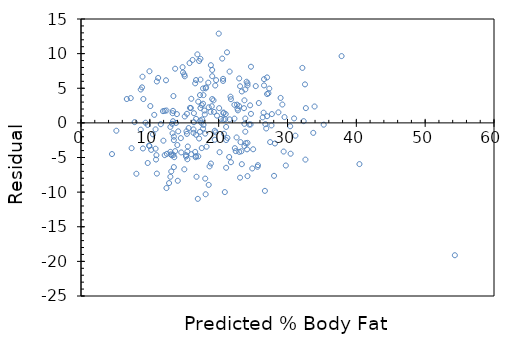
| Category | Series 0 |
|---|---|
| 14.50261858650596 | -2.203 |
| 13.110198963243775 | -7.01 |
| 16.211497215055005 | 9.089 |
| 15.262120199194428 | -4.862 |
| 23.86980514299701 | 4.83 |
| 20.325464283784186 | 0.575 |
| 17.983667644661416 | 1.216 |
| 16.59124802139923 | -4.191 |
| 12.793739957956916 | -8.694 |
| 16.6545398224566 | -4.955 |
| 13.489949769588002 | -6.39 |
| 18.110251246776166 | -10.31 |
| 18.55329385417776 | 2.247 |
| 25.009057562029696 | -3.809 |
| 21.59130030493162 | 0.509 |
| 19.312795466866227 | 1.587 |
| 21.59130030493162 | 7.409 |
| 22.287510116562707 | 0.612 |
| 17.287457833030324 | -1.287 |
| 24.18626414828387 | -7.686 |
| 21.274841299644763 | -2.175 |
| 23.110303530308542 | -7.91 |
| 8.932940093457233 | 6.667 |
| 11.211444931522621 | 6.489 |
| 8.869648292399852 | 5.13 |
| 11.021569528350504 | -7.322 |
| 7.793687674424525 | 0.106 |
| 16.71783162351398 | 6.182 |
| 7.350645067022931 | -3.651 |
| 13.426657968530634 | -4.627 |
| 16.71783162351398 | -4.818 |
| 14.059575979104352 | -8.36 |
| 10.641818722006263 | 1.158 |
| 24.18626414828387 | -2.886 |
| 33.74332610794703 | -1.443 |
| 32.16103108151273 | 7.939 |
| 24.43943135251336 | -0.239 |
| 23.110303530308542 | 5.29 |
| 54.31316145159292 | -19.113 |
| 28.996441028644128 | 3.604 |
| 40.45225702002847 | -5.952 |
| 26.591352588464005 | 6.309 |
| 30.95848686142267 | 0.642 |
| 26.591352588464005 | 5.409 |
| 8.679772889227742 | -0.98 |
| 12.160821947383198 | 1.739 |
| 7.224061464908189 | 3.576 |
| 10.894985926235755 | -5.295 |
| 13.363366167473266 | 0.237 |
| 5.135432030014911 | -1.135 |
| 15.451995602366537 | -5.252 |
| 9.88231710931781 | -3.282 |
| 12.477280952670057 | -4.477 |
| 10.95827772729313 | -4.658 |
| 9.692441706145686 | -5.792 |
| 23.86980514299701 | -1.27 |
| 23.74322154088226 | -3.343 |
| 26.52806078740663 | 1.472 |
| 27.224270599037723 | 4.276 |
| 22.793844525021683 | 1.806 |
| 26.907811593750864 | -0.808 |
| 20.515339686956295 | 9.285 |
| 25.388808368373944 | 5.311 |
| 23.679929739824892 | 2.12 |
| 27.350854201152472 | 4.949 |
| 24.05968054616912 | 5.94 |
| 13.679825172760125 | 7.82 |
| 15.388703801309163 | -1.589 |
| 10.19877611460467 | -3.899 |
| 14.122867780161727 | -1.223 |
| 18.490002053120392 | 5.81 |
| 12.983615361129033 | -4.184 |
| 13.046907162186407 | -4.547 |
| 8.679772889227742 | 4.82 |
| 13.300074366415892 | -1.5 |
| 12.350697350555308 | 6.149 |
| 10.451943318834154 | -1.652 |
| 20.705215090128412 | 1.495 |
| 20.958382294357904 | 0.542 |
| 22.9837199281938 | -4.184 |
| 21.211549498587388 | 10.188 |
| 16.90770702668609 | 9.892 |
| 22.477385519734824 | -4.077 |
| 20.641923289071045 | 6.358 |
| 23.74322154088226 | 3.257 |
| 17.3507496340877 | 9.249 |
| 16.33808081716974 | -1.438 |
| 18.110251246776166 | 4.99 |
| 15.008952994964936 | -6.709 |
| 15.325412000251795 | -1.225 |
| 21.08496589647264 | -0.585 |
| 19.56596267109572 | -1.366 |
| 13.173490764301143 | -4.673 |
| 22.287510116562707 | 2.612 |
| 16.781123424571348 | -7.781 |
| 23.363470734538033 | -5.963 |
| 18.55329385417776 | -8.953 |
| 15.451995602366537 | -4.152 |
| 16.40137261822712 | 1.399 |
| 20.072297079554694 | 2.128 |
| 20.705215090128412 | 0.495 |
| 18.80646105840725 | 1.594 |
| 17.03429062880084 | 3.066 |
| 21.02167409541527 | 1.278 |
| 22.9837199281938 | 2.416 |
| 15.83174640871077 | 2.168 |
| 25.641975572603428 | -6.342 |
| 24.88247395991496 | -6.582 |
| 16.71783162351398 | 0.582 |
| 18.996336461579368 | 2.404 |
| 17.92037584360404 | 1.78 |
| 27.0343951958656 | 0.966 |
| 20.705215090128412 | 1.395 |
| 17.287457833030324 | 4.013 |
| 19.059628262636743 | 7.64 |
| 15.388703801309163 | 1.311 |
| 17.540625037259815 | 2.559 |
| 17.540625037259815 | -3.641 |
| 19.059628262636743 | 6.74 |
| 15.958330010825513 | 2.142 |
| 23.363470734538033 | 4.537 |
| 22.66726092290694 | 2.633 |
| 13.300074366415892 | 1.4 |
| 15.072244796022304 | 0.928 |
| 13.80640877487486 | -0.006 |
| 17.477333236202448 | 0.023 |
| 18.86975285946462 | 8.33 |
| 9.945608910375178 | 7.454 |
| 19.755838074267828 | 1.044 |
| 15.641871005538654 | -0.742 |
| 17.603916838317183 | 0.496 |
| 17.730500440431925 | 4.969 |
| 23.74322154088226 | -0.143 |
| 17.16087423091558 | 8.939 |
| 15.768454607653403 | 8.632 |
| 24.566014954628095 | 2.534 |
| 15.072244796022304 | 6.728 |
| 22.9837199281938 | 6.416 |
| 16.59124802139923 | 5.709 |
| 28.04706401278355 | -7.647 |
| 19.502670870038337 | 5.397 |
| 19.43937906898097 | -1.139 |
| 18.173543047833533 | 5.126 |
| 9.375982700858827 | 0.024 |
| 14.565910387563328 | -4.266 |
| 12.41398915161269 | 1.786 |
| 23.30017893348066 | -4.1 |
| 24.18626414828387 | 5.414 |
| 8.996231894514601 | -3.696 |
| 28.1736476148983 | -2.974 |
| 9.692441706145686 | -0.292 |
| 25.705267373660803 | -6.105 |
| 6.654435255391832 | 3.446 |
| 16.40137261822712 | 0.099 |
| 23.933096944054377 | -2.933 |
| 13.426657968530634 | 3.873 |
| 27.0343951958656 | 4.166 |
| 18.046959445718784 | -8.047 |
| 9.059523695571968 | 3.44 |
| 19.059628262636743 | 3.44 |
| 11.970946544211081 | -2.571 |
| 21.08496589647264 | -6.485 |
| 18.86975285946462 | -5.87 |
| 13.363366167473266 | 1.737 |
| 27.66731320643933 | -0.367 |
| 20.76850689118578 | -1.569 |
| 17.793792241489307 | 4.006 |
| 24.1229723472265 | -3.823 |
| 33.93320151111915 | 2.367 |
| 18.046959445718784 | -1.547 |
| 12.41398915161269 | -9.414 |
| 8.046854878654017 | -7.347 |
| 17.730500440431925 | 2.769 |
| 17.730500440431925 | -0.831 |
| 29.439483636045736 | -4.139 |
| 10.831694125178387 | -0.932 |
| 13.236782565358524 | -0.137 |
| 30.388860651906313 | -0.489 |
| 19.24950366580886 | 3.25 |
| 26.71793619057874 | -9.818 |
| 26.781227991636115 | -0.181 |
| 4.502514019441193 | -4.503 |
| 13.489949769588002 | -1.99 |
| 15.515287403423912 | -3.415 |
| 17.793792241489307 | -0.294 |
| 13.553241570645383 | -4.953 |
| 29.755942641332595 | -6.156 |
| 23.173595331365924 | -2.774 |
| 22.603969121849566 | -2.104 |
| 24.629306755685477 | -0.229 |
| 11.591195737866848 | -0.191 |
| 32.540781887856966 | 5.559 |
| 20.13558888061206 | -4.236 |
| 27.477437803267208 | -2.777 |
| 14.755785790735445 | 8.044 |
| 21.717883907046357 | 3.782 |
| 15.008952994964936 | 6.991 |
| 17.3507496340877 | 0.349 |
| 9.945608910375178 | -3.346 |
| 17.3507496340877 | 6.249 |
| 17.03429062880084 | -4.834 |
| 14.81907759179282 | 7.281 |
| 25.831850975775538 | 2.868 |
| 16.970998827743465 | -10.971 |
| 32.667365489971715 | 2.133 |
| 21.528008503874247 | -4.928 |
| 20.00900527849732 | 12.891 |
| 24.692598556742837 | 8.107 |
| 13.679825172760125 | -4.08 |
| 13.996284178046984 | -3.196 |
| 10.831694125178387 | -3.732 |
| 26.40147718529188 | 0.799 |
| 17.3507496340877 | 2.149 |
| 22.350801917620075 | -3.651 |
| 16.02162181188288 | 3.478 |
| 37.85729317667621 | 9.643 |
| 11.907654743153707 | 1.692 |
| 12.160821947383198 | -4.661 |
| 23.86980514299701 | 0.63 |
| 16.71783162351398 | -1.718 |
| 18.67987745629251 | -6.28 |
| 30.452152452963702 | -4.452 |
| 16.02162181188288 | -4.522 |
| 12.983615361129033 | -7.784 |
| 20.895090493300522 | -9.995 |
| 10.072192512489927 | 2.428 |
| 18.2368348488909 | -3.437 |
| 21.78117570810374 | 3.419 |
| 17.16087423091558 | -2.261 |
| 19.43937906898097 | -2.439 |
| 15.262120199194428 | -4.662 |
| 21.78117570810374 | -5.681 |
| 16.33808081716974 | -0.938 |
| 20.641923289071045 | 6.058 |
| 19.629254472153086 | 6.171 |
| 21.08496589647264 | -2.485 |
| 22.730552723964315 | 2.069 |
| 32.60407368891434 | -5.304 |
| 12.983615361129033 | -0.584 |
| 24.18626414828387 | 5.714 |
| 11.021569528350504 | 5.978 |
| 35.26232933332396 | -0.262 |
| 29.566067238160485 | 0.834 |
| 32.350906484684856 | 0.249 |
| 27.730605007496692 | 1.269 |
| 13.93299237698961 | 1.267 |
| 28.67998202335727 | 1.52 |
| 13.489949769588002 | -2.49 |
| 27.0343951958656 | 6.566 |
| 31.14836226459478 | -1.848 |
| 24.692598556742837 | 1.307 |
| 29.249608232873626 | 2.65 |